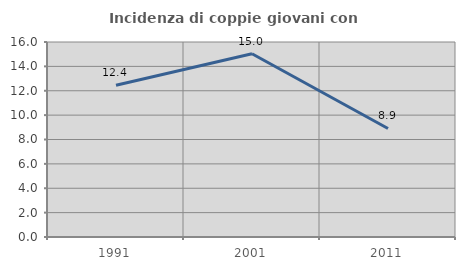
| Category | Incidenza di coppie giovani con figli |
|---|---|
| 1991.0 | 12.45 |
| 2001.0 | 15.035 |
| 2011.0 | 8.904 |